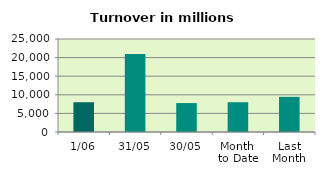
| Category | Series 0 |
|---|---|
| 1/06 | 8003.474 |
| 31/05 | 20982.732 |
| 30/05 | 7781.131 |
| Month 
to Date | 8003.474 |
| Last
Month | 9444.716 |